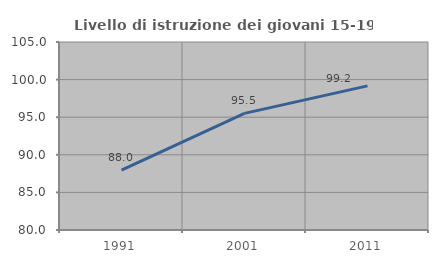
| Category | Livello di istruzione dei giovani 15-19 anni |
|---|---|
| 1991.0 | 87.965 |
| 2001.0 | 95.512 |
| 2011.0 | 99.17 |